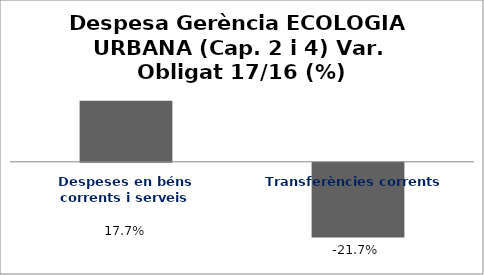
| Category | Series 0 |
|---|---|
| Despeses en béns corrents i serveis | 0.177 |
| Transferències corrents | -0.217 |